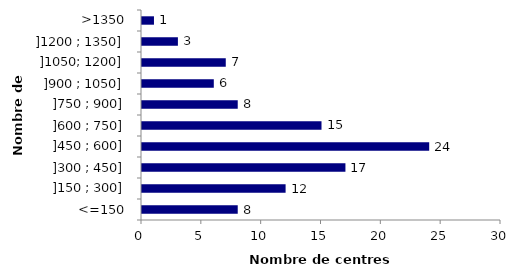
| Category | Series 0 |
|---|---|
| <=150 | 8 |
| ]150 ; 300] | 12 |
| ]300 ; 450] | 17 |
| ]450 ; 600] | 24 |
| ]600 ; 750] | 15 |
| ]750 ; 900] | 8 |
| ]900 ; 1050] | 6 |
| ]1050; 1200] | 7 |
| ]1200 ; 1350] | 3 |
| >1350 | 1 |